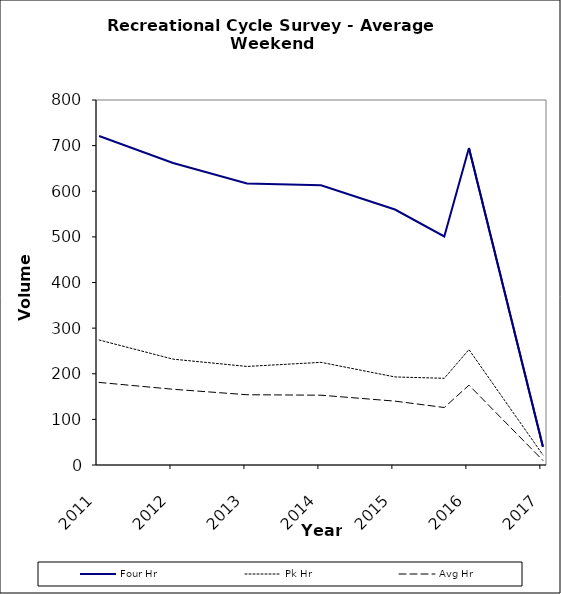
| Category | Four Hr | Pk Hr | Avg Hr |
|---|---|---|---|
| 2011-03-01 | 721 | 274 | 181 |
| 2012-03-01 | 662 | 232 | 166 |
| 2013-03-01 | 617 | 216 | 154 |
| 2014-03-01 | 613 | 225 | 153 |
| 2015-03-01 | 560 | 193 | 140 |
| 2015-11-01 | 501 | 190 | 126 |
| 2016-03-01 | 695 | 253 | 175 |
| 2017-03-01 | 40 | 22 | 10 |